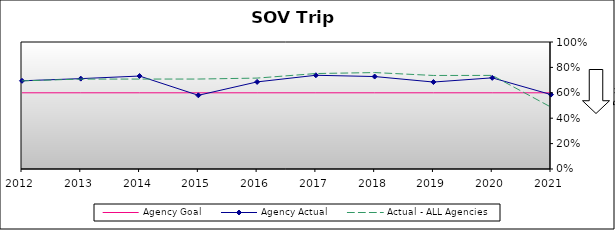
| Category | Agency Goal | Agency Actual | Actual - ALL Agencies |
|---|---|---|---|
| 2012.0 | 0.6 | 0.695 | 0.694 |
| 2013.0 | 0.6 | 0.712 | 0.708 |
| 2014.0 | 0.6 | 0.732 | 0.708 |
| 2015.0 | 0.6 | 0.58 | 0.708 |
| 2016.0 | 0.6 | 0.686 | 0.716 |
| 2017.0 | 0.6 | 0.738 | 0.752 |
| 2018.0 | 0.6 | 0.728 | 0.759 |
| 2019.0 | 0.6 | 0.685 | 0.736 |
| 2020.0 | 0.6 | 0.718 | 0.737 |
| 2021.0 | 0.6 | 0.586 | 0.487 |